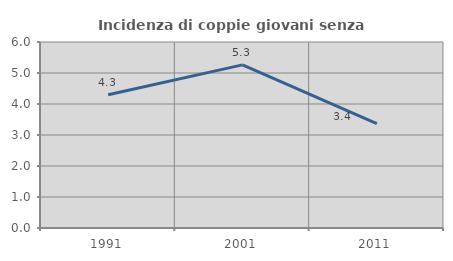
| Category | Incidenza di coppie giovani senza figli |
|---|---|
| 1991.0 | 4.301 |
| 2001.0 | 5.263 |
| 2011.0 | 3.371 |